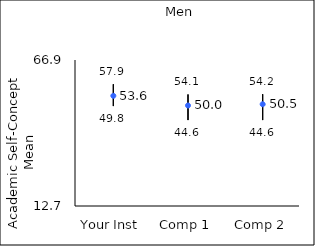
| Category | 25th percentile | 75th percentile | Mean |
|---|---|---|---|
| Your Inst | 49.8 | 57.9 | 53.6 |
| Comp 1 | 44.6 | 54.1 | 50.01 |
| Comp 2 | 44.6 | 54.2 | 50.48 |